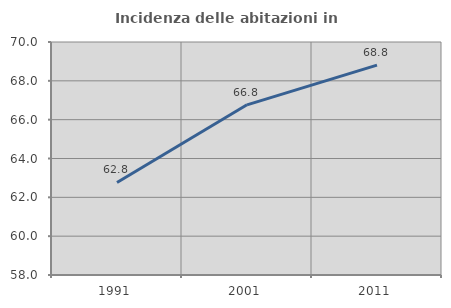
| Category | Incidenza delle abitazioni in proprietà  |
|---|---|
| 1991.0 | 62.766 |
| 2001.0 | 66.764 |
| 2011.0 | 68.809 |